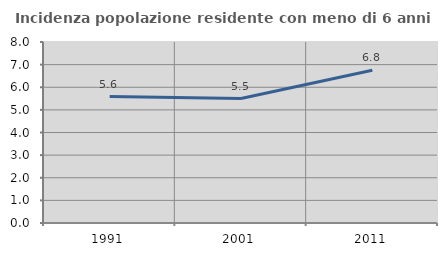
| Category | Incidenza popolazione residente con meno di 6 anni |
|---|---|
| 1991.0 | 5.588 |
| 2001.0 | 5.502 |
| 2011.0 | 6.754 |